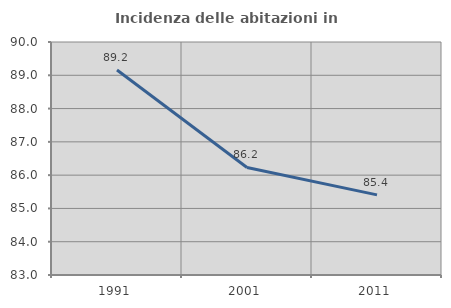
| Category | Incidenza delle abitazioni in proprietà  |
|---|---|
| 1991.0 | 89.157 |
| 2001.0 | 86.232 |
| 2011.0 | 85.407 |